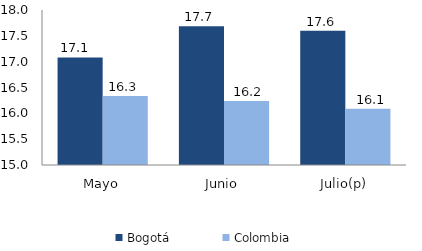
| Category | Bogotá | Colombia |
|---|---|---|
| Mayo | 17.081 | 16.334 |
| Junio | 17.684 | 16.237 |
| Julio(p) | 17.6 | 16.088 |